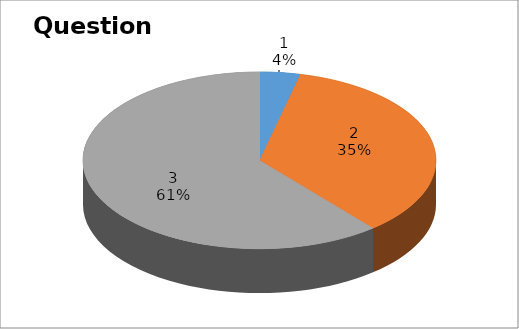
| Category | Series 0 |
|---|---|
| 0 | 2 |
| 1 | 19 |
| 2 | 33 |